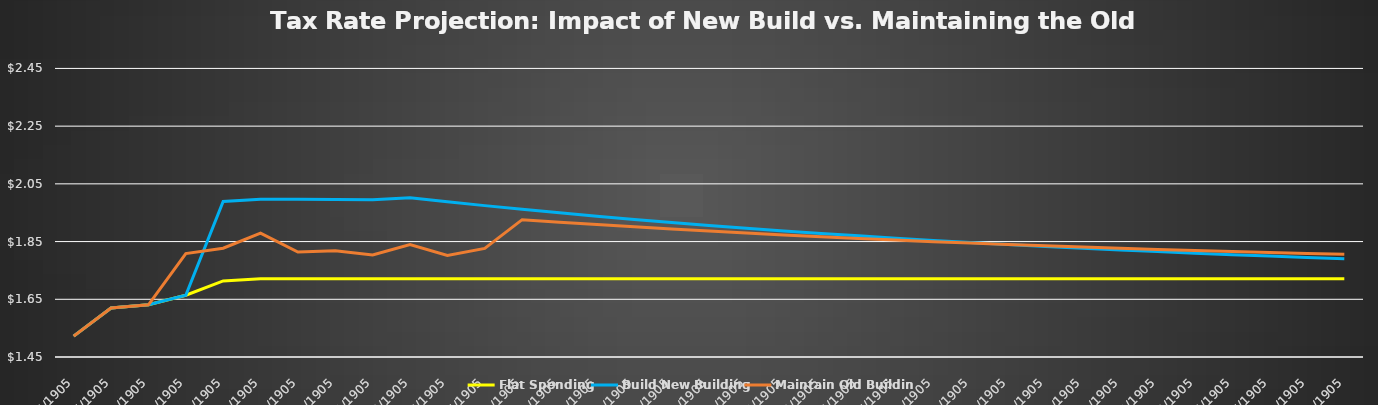
| Category | Flat Spending | Build New Building | Maintain Old Building |
|---|---|---|---|
| 2024.0 | 1.522 | 1.522 | 1.522 |
| 2025.0 | 1.62 | 1.62 | 1.62 |
| 2026.0 | 1.631 | 1.631 | 1.631 |
| 2027.0 | 1.664 | 1.664 | 1.808 |
| 2028.0 | 1.714 | 1.989 | 1.827 |
| 2029.0 | 1.721 | 1.996 | 1.879 |
| 2030.0 | 1.721 | 1.996 | 1.814 |
| 2031.0 | 1.721 | 1.996 | 1.818 |
| 2032.0 | 1.721 | 1.995 | 1.803 |
| 2033.0 | 1.721 | 2.002 | 1.84 |
| 2034.0 | 1.721 | 1.988 | 1.802 |
| 2035.0 | 1.721 | 1.975 | 1.826 |
| 2036.0 | 1.721 | 1.962 | 1.926 |
| 2037.0 | 1.721 | 1.95 | 1.917 |
| 2038.0 | 1.721 | 1.938 | 1.909 |
| 2039.0 | 1.721 | 1.927 | 1.901 |
| 2040.0 | 1.721 | 1.916 | 1.893 |
| 2041.0 | 1.721 | 1.906 | 1.886 |
| 2042.0 | 1.721 | 1.896 | 1.879 |
| 2043.0 | 1.721 | 1.887 | 1.873 |
| 2044.0 | 1.721 | 1.878 | 1.867 |
| 2045.0 | 1.721 | 1.87 | 1.861 |
| 2046.0 | 1.721 | 1.862 | 1.855 |
| 2047.0 | 1.721 | 1.854 | 1.85 |
| 2048.0 | 1.721 | 1.847 | 1.845 |
| 2049.0 | 1.721 | 1.84 | 1.84 |
| 2050.0 | 1.721 | 1.833 | 1.835 |
| 2051.0 | 1.721 | 1.827 | 1.831 |
| 2052.0 | 1.721 | 1.821 | 1.827 |
| 2053.0 | 1.721 | 1.815 | 1.823 |
| 2054.0 | 1.721 | 1.81 | 1.819 |
| 2055.0 | 1.721 | 1.805 | 1.816 |
| 2056.0 | 1.721 | 1.8 | 1.812 |
| 2057.0 | 1.721 | 1.795 | 1.809 |
| 2058.0 | 1.721 | 1.79 | 1.806 |